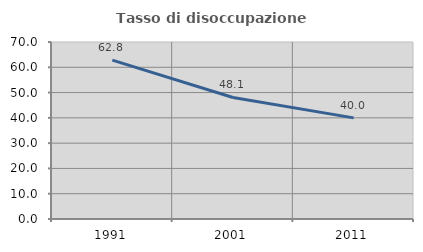
| Category | Tasso di disoccupazione giovanile  |
|---|---|
| 1991.0 | 62.807 |
| 2001.0 | 48.065 |
| 2011.0 | 40 |